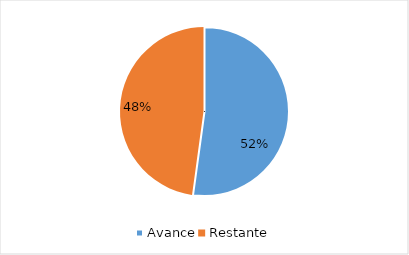
| Category | Series 0 |
|---|---|
| Avance | 0.522 |
| Restante | 0.478 |